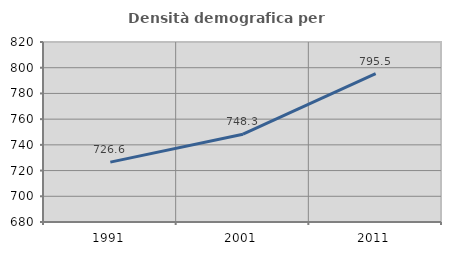
| Category | Densità demografica |
|---|---|
| 1991.0 | 726.57 |
| 2001.0 | 748.303 |
| 2011.0 | 795.481 |